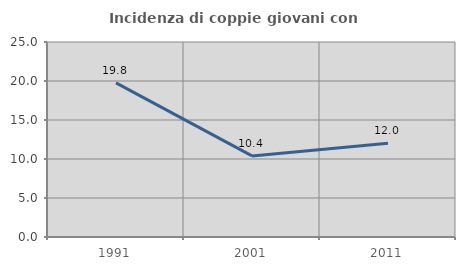
| Category | Incidenza di coppie giovani con figli |
|---|---|
| 1991.0 | 19.762 |
| 2001.0 | 10.399 |
| 2011.0 | 12.016 |